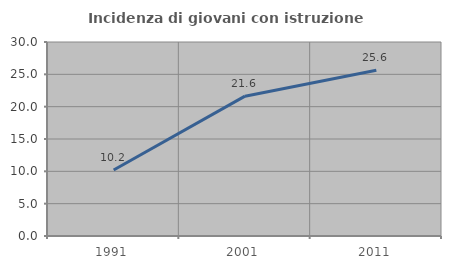
| Category | Incidenza di giovani con istruzione universitaria |
|---|---|
| 1991.0 | 10.204 |
| 2001.0 | 21.622 |
| 2011.0 | 25.641 |